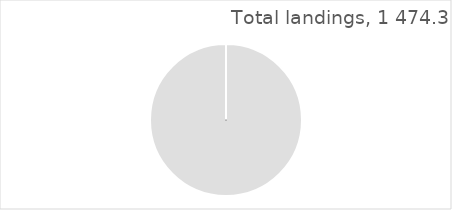
| Category | Arctic Ocean |
|---|---|
| 0 | 1474.346 |